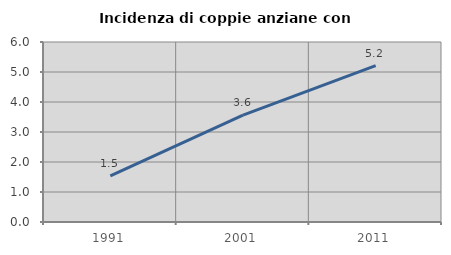
| Category | Incidenza di coppie anziane con figli |
|---|---|
| 1991.0 | 1.538 |
| 2001.0 | 3.565 |
| 2011.0 | 5.212 |